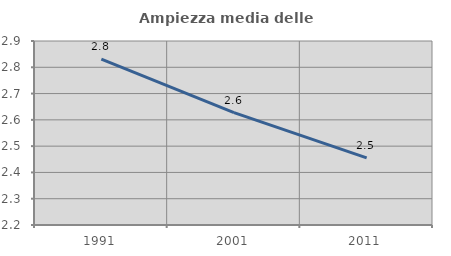
| Category | Ampiezza media delle famiglie |
|---|---|
| 1991.0 | 2.831 |
| 2001.0 | 2.628 |
| 2011.0 | 2.455 |